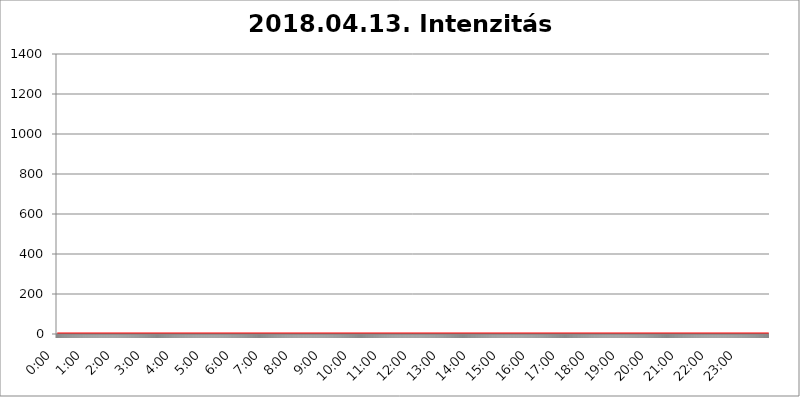
| Category | 2018.04.13. Intenzitás [W/m^2] |
|---|---|
| 0.0 | 0 |
| 0.0006944444444444445 | 0 |
| 0.001388888888888889 | 0 |
| 0.0020833333333333333 | 0 |
| 0.002777777777777778 | 0 |
| 0.003472222222222222 | 0 |
| 0.004166666666666667 | 0 |
| 0.004861111111111111 | 0 |
| 0.005555555555555556 | 0 |
| 0.0062499999999999995 | 0 |
| 0.006944444444444444 | 0 |
| 0.007638888888888889 | 0 |
| 0.008333333333333333 | 0 |
| 0.009027777777777779 | 0 |
| 0.009722222222222222 | 0 |
| 0.010416666666666666 | 0 |
| 0.011111111111111112 | 0 |
| 0.011805555555555555 | 0 |
| 0.012499999999999999 | 0 |
| 0.013194444444444444 | 0 |
| 0.013888888888888888 | 0 |
| 0.014583333333333332 | 0 |
| 0.015277777777777777 | 0 |
| 0.015972222222222224 | 0 |
| 0.016666666666666666 | 0 |
| 0.017361111111111112 | 0 |
| 0.018055555555555557 | 0 |
| 0.01875 | 0 |
| 0.019444444444444445 | 0 |
| 0.02013888888888889 | 0 |
| 0.020833333333333332 | 0 |
| 0.02152777777777778 | 0 |
| 0.022222222222222223 | 0 |
| 0.02291666666666667 | 0 |
| 0.02361111111111111 | 0 |
| 0.024305555555555556 | 0 |
| 0.024999999999999998 | 0 |
| 0.025694444444444447 | 0 |
| 0.02638888888888889 | 0 |
| 0.027083333333333334 | 0 |
| 0.027777777777777776 | 0 |
| 0.02847222222222222 | 0 |
| 0.029166666666666664 | 0 |
| 0.029861111111111113 | 0 |
| 0.030555555555555555 | 0 |
| 0.03125 | 0 |
| 0.03194444444444445 | 0 |
| 0.03263888888888889 | 0 |
| 0.03333333333333333 | 0 |
| 0.034027777777777775 | 0 |
| 0.034722222222222224 | 0 |
| 0.035416666666666666 | 0 |
| 0.036111111111111115 | 0 |
| 0.03680555555555556 | 0 |
| 0.0375 | 0 |
| 0.03819444444444444 | 0 |
| 0.03888888888888889 | 0 |
| 0.03958333333333333 | 0 |
| 0.04027777777777778 | 0 |
| 0.04097222222222222 | 0 |
| 0.041666666666666664 | 0 |
| 0.042361111111111106 | 0 |
| 0.04305555555555556 | 0 |
| 0.043750000000000004 | 0 |
| 0.044444444444444446 | 0 |
| 0.04513888888888889 | 0 |
| 0.04583333333333334 | 0 |
| 0.04652777777777778 | 0 |
| 0.04722222222222222 | 0 |
| 0.04791666666666666 | 0 |
| 0.04861111111111111 | 0 |
| 0.049305555555555554 | 0 |
| 0.049999999999999996 | 0 |
| 0.05069444444444445 | 0 |
| 0.051388888888888894 | 0 |
| 0.052083333333333336 | 0 |
| 0.05277777777777778 | 0 |
| 0.05347222222222222 | 0 |
| 0.05416666666666667 | 0 |
| 0.05486111111111111 | 0 |
| 0.05555555555555555 | 0 |
| 0.05625 | 0 |
| 0.05694444444444444 | 0 |
| 0.057638888888888885 | 0 |
| 0.05833333333333333 | 0 |
| 0.05902777777777778 | 0 |
| 0.059722222222222225 | 0 |
| 0.06041666666666667 | 0 |
| 0.061111111111111116 | 0 |
| 0.06180555555555556 | 0 |
| 0.0625 | 0 |
| 0.06319444444444444 | 0 |
| 0.06388888888888888 | 0 |
| 0.06458333333333334 | 0 |
| 0.06527777777777778 | 0 |
| 0.06597222222222222 | 0 |
| 0.06666666666666667 | 0 |
| 0.06736111111111111 | 0 |
| 0.06805555555555555 | 0 |
| 0.06874999999999999 | 0 |
| 0.06944444444444443 | 0 |
| 0.07013888888888889 | 0 |
| 0.07083333333333333 | 0 |
| 0.07152777777777779 | 0 |
| 0.07222222222222223 | 0 |
| 0.07291666666666667 | 0 |
| 0.07361111111111111 | 0 |
| 0.07430555555555556 | 0 |
| 0.075 | 0 |
| 0.07569444444444444 | 0 |
| 0.0763888888888889 | 0 |
| 0.07708333333333334 | 0 |
| 0.07777777777777778 | 0 |
| 0.07847222222222222 | 0 |
| 0.07916666666666666 | 0 |
| 0.0798611111111111 | 0 |
| 0.08055555555555556 | 0 |
| 0.08125 | 0 |
| 0.08194444444444444 | 0 |
| 0.08263888888888889 | 0 |
| 0.08333333333333333 | 0 |
| 0.08402777777777777 | 0 |
| 0.08472222222222221 | 0 |
| 0.08541666666666665 | 0 |
| 0.08611111111111112 | 0 |
| 0.08680555555555557 | 0 |
| 0.08750000000000001 | 0 |
| 0.08819444444444445 | 0 |
| 0.08888888888888889 | 0 |
| 0.08958333333333333 | 0 |
| 0.09027777777777778 | 0 |
| 0.09097222222222222 | 0 |
| 0.09166666666666667 | 0 |
| 0.09236111111111112 | 0 |
| 0.09305555555555556 | 0 |
| 0.09375 | 0 |
| 0.09444444444444444 | 0 |
| 0.09513888888888888 | 0 |
| 0.09583333333333333 | 0 |
| 0.09652777777777777 | 0 |
| 0.09722222222222222 | 0 |
| 0.09791666666666667 | 0 |
| 0.09861111111111111 | 0 |
| 0.09930555555555555 | 0 |
| 0.09999999999999999 | 0 |
| 0.10069444444444443 | 0 |
| 0.1013888888888889 | 0 |
| 0.10208333333333335 | 0 |
| 0.10277777777777779 | 0 |
| 0.10347222222222223 | 0 |
| 0.10416666666666667 | 0 |
| 0.10486111111111111 | 0 |
| 0.10555555555555556 | 0 |
| 0.10625 | 0 |
| 0.10694444444444444 | 0 |
| 0.1076388888888889 | 0 |
| 0.10833333333333334 | 0 |
| 0.10902777777777778 | 0 |
| 0.10972222222222222 | 0 |
| 0.1111111111111111 | 0 |
| 0.11180555555555556 | 0 |
| 0.11180555555555556 | 0 |
| 0.1125 | 0 |
| 0.11319444444444444 | 0 |
| 0.11388888888888889 | 0 |
| 0.11458333333333333 | 0 |
| 0.11527777777777777 | 0 |
| 0.11597222222222221 | 0 |
| 0.11666666666666665 | 0 |
| 0.1173611111111111 | 0 |
| 0.11805555555555557 | 0 |
| 0.11944444444444445 | 0 |
| 0.12013888888888889 | 0 |
| 0.12083333333333333 | 0 |
| 0.12152777777777778 | 0 |
| 0.12222222222222223 | 0 |
| 0.12291666666666667 | 0 |
| 0.12291666666666667 | 0 |
| 0.12361111111111112 | 0 |
| 0.12430555555555556 | 0 |
| 0.125 | 0 |
| 0.12569444444444444 | 0 |
| 0.12638888888888888 | 0 |
| 0.12708333333333333 | 0 |
| 0.16875 | 0 |
| 0.12847222222222224 | 0 |
| 0.12916666666666668 | 0 |
| 0.12986111111111112 | 0 |
| 0.13055555555555556 | 0 |
| 0.13125 | 0 |
| 0.13194444444444445 | 0 |
| 0.1326388888888889 | 0 |
| 0.13333333333333333 | 0 |
| 0.13402777777777777 | 0 |
| 0.13402777777777777 | 0 |
| 0.13472222222222222 | 0 |
| 0.13541666666666666 | 0 |
| 0.1361111111111111 | 0 |
| 0.13749999999999998 | 0 |
| 0.13819444444444443 | 0 |
| 0.1388888888888889 | 0 |
| 0.13958333333333334 | 0 |
| 0.14027777777777778 | 0 |
| 0.14097222222222222 | 0 |
| 0.14166666666666666 | 0 |
| 0.1423611111111111 | 0 |
| 0.14305555555555557 | 0 |
| 0.14375000000000002 | 0 |
| 0.14444444444444446 | 0 |
| 0.1451388888888889 | 0 |
| 0.1451388888888889 | 0 |
| 0.14652777777777778 | 0 |
| 0.14722222222222223 | 0 |
| 0.14791666666666667 | 0 |
| 0.1486111111111111 | 0 |
| 0.14930555555555555 | 0 |
| 0.15 | 0 |
| 0.15069444444444444 | 0 |
| 0.15138888888888888 | 0 |
| 0.15208333333333332 | 0 |
| 0.15277777777777776 | 0 |
| 0.15347222222222223 | 0 |
| 0.15416666666666667 | 0 |
| 0.15486111111111112 | 0 |
| 0.15555555555555556 | 0 |
| 0.15625 | 0 |
| 0.15694444444444444 | 0 |
| 0.15763888888888888 | 0 |
| 0.15833333333333333 | 0 |
| 0.15902777777777777 | 0 |
| 0.15972222222222224 | 0 |
| 0.16041666666666668 | 0 |
| 0.16111111111111112 | 0 |
| 0.16180555555555556 | 0 |
| 0.1625 | 0 |
| 0.16319444444444445 | 0 |
| 0.1638888888888889 | 0 |
| 0.16458333333333333 | 0 |
| 0.16527777777777777 | 0 |
| 0.16597222222222222 | 0 |
| 0.16666666666666666 | 0 |
| 0.1673611111111111 | 0 |
| 0.16805555555555554 | 0 |
| 0.16874999999999998 | 0 |
| 0.16944444444444443 | 0 |
| 0.17013888888888887 | 0 |
| 0.1708333333333333 | 0 |
| 0.17152777777777775 | 0 |
| 0.17222222222222225 | 0 |
| 0.1729166666666667 | 0 |
| 0.17361111111111113 | 0 |
| 0.17430555555555557 | 0 |
| 0.17500000000000002 | 0 |
| 0.17569444444444446 | 0 |
| 0.1763888888888889 | 0 |
| 0.17708333333333334 | 0 |
| 0.17777777777777778 | 0 |
| 0.17847222222222223 | 0 |
| 0.17916666666666667 | 0 |
| 0.1798611111111111 | 0 |
| 0.18055555555555555 | 0 |
| 0.18125 | 0 |
| 0.18194444444444444 | 0 |
| 0.1826388888888889 | 0 |
| 0.18333333333333335 | 0 |
| 0.1840277777777778 | 0 |
| 0.18472222222222223 | 0 |
| 0.18541666666666667 | 0 |
| 0.18611111111111112 | 0 |
| 0.18680555555555556 | 0 |
| 0.1875 | 0 |
| 0.18819444444444444 | 0 |
| 0.18888888888888888 | 0 |
| 0.18958333333333333 | 0 |
| 0.19027777777777777 | 0 |
| 0.1909722222222222 | 0 |
| 0.19166666666666665 | 0 |
| 0.19236111111111112 | 0 |
| 0.19305555555555554 | 0 |
| 0.19375 | 0 |
| 0.19444444444444445 | 0 |
| 0.1951388888888889 | 0 |
| 0.19583333333333333 | 0 |
| 0.19652777777777777 | 0 |
| 0.19722222222222222 | 0 |
| 0.19791666666666666 | 0 |
| 0.1986111111111111 | 0 |
| 0.19930555555555554 | 0 |
| 0.19999999999999998 | 0 |
| 0.20069444444444443 | 0 |
| 0.20138888888888887 | 0 |
| 0.2020833333333333 | 0 |
| 0.2027777777777778 | 0 |
| 0.2034722222222222 | 0 |
| 0.2041666666666667 | 0 |
| 0.20486111111111113 | 0 |
| 0.20555555555555557 | 0 |
| 0.20625000000000002 | 0 |
| 0.20694444444444446 | 0 |
| 0.2076388888888889 | 0 |
| 0.20833333333333334 | 0 |
| 0.20902777777777778 | 0 |
| 0.20972222222222223 | 0 |
| 0.21041666666666667 | 0 |
| 0.2111111111111111 | 0 |
| 0.21180555555555555 | 0 |
| 0.2125 | 0 |
| 0.21319444444444444 | 0 |
| 0.2138888888888889 | 0 |
| 0.21458333333333335 | 0 |
| 0.2152777777777778 | 0 |
| 0.21597222222222223 | 0 |
| 0.21666666666666667 | 0 |
| 0.21736111111111112 | 0 |
| 0.21805555555555556 | 0 |
| 0.21875 | 0 |
| 0.21944444444444444 | 0 |
| 0.22013888888888888 | 0 |
| 0.22083333333333333 | 0 |
| 0.22152777777777777 | 0 |
| 0.2222222222222222 | 0 |
| 0.22291666666666665 | 0 |
| 0.2236111111111111 | 0 |
| 0.22430555555555556 | 0 |
| 0.225 | 0 |
| 0.22569444444444445 | 0 |
| 0.2263888888888889 | 0 |
| 0.22708333333333333 | 0 |
| 0.22777777777777777 | 0 |
| 0.22847222222222222 | 0 |
| 0.22916666666666666 | 0 |
| 0.2298611111111111 | 0 |
| 0.23055555555555554 | 0 |
| 0.23124999999999998 | 0 |
| 0.23194444444444443 | 0 |
| 0.23263888888888887 | 0 |
| 0.2333333333333333 | 0 |
| 0.2340277777777778 | 0 |
| 0.2347222222222222 | 0 |
| 0.2354166666666667 | 0 |
| 0.23611111111111113 | 0 |
| 0.23680555555555557 | 0 |
| 0.23750000000000002 | 0 |
| 0.23819444444444446 | 0 |
| 0.2388888888888889 | 0 |
| 0.23958333333333334 | 0 |
| 0.24027777777777778 | 0 |
| 0.24097222222222223 | 0 |
| 0.24166666666666667 | 0 |
| 0.2423611111111111 | 0 |
| 0.24305555555555555 | 0 |
| 0.24375 | 0 |
| 0.24444444444444446 | 0 |
| 0.24513888888888888 | 0 |
| 0.24583333333333335 | 0 |
| 0.2465277777777778 | 0 |
| 0.24722222222222223 | 0 |
| 0.24791666666666667 | 0 |
| 0.24861111111111112 | 0 |
| 0.24930555555555556 | 0 |
| 0.25 | 0 |
| 0.25069444444444444 | 0 |
| 0.2513888888888889 | 0 |
| 0.2520833333333333 | 0 |
| 0.25277777777777777 | 0 |
| 0.2534722222222222 | 0 |
| 0.25416666666666665 | 0 |
| 0.2548611111111111 | 0 |
| 0.2555555555555556 | 0 |
| 0.25625000000000003 | 0 |
| 0.2569444444444445 | 0 |
| 0.2576388888888889 | 0 |
| 0.25833333333333336 | 0 |
| 0.2590277777777778 | 0 |
| 0.25972222222222224 | 0 |
| 0.2604166666666667 | 0 |
| 0.2611111111111111 | 0 |
| 0.26180555555555557 | 0 |
| 0.2625 | 0 |
| 0.26319444444444445 | 0 |
| 0.2638888888888889 | 0 |
| 0.26458333333333334 | 0 |
| 0.2652777777777778 | 0 |
| 0.2659722222222222 | 0 |
| 0.26666666666666666 | 0 |
| 0.2673611111111111 | 0 |
| 0.26805555555555555 | 0 |
| 0.26875 | 0 |
| 0.26944444444444443 | 0 |
| 0.2701388888888889 | 0 |
| 0.2708333333333333 | 0 |
| 0.27152777777777776 | 0 |
| 0.2722222222222222 | 0 |
| 0.27291666666666664 | 0 |
| 0.2736111111111111 | 0 |
| 0.2743055555555555 | 0 |
| 0.27499999999999997 | 0 |
| 0.27569444444444446 | 0 |
| 0.27638888888888885 | 0 |
| 0.27708333333333335 | 0 |
| 0.2777777777777778 | 0 |
| 0.27847222222222223 | 0 |
| 0.2791666666666667 | 0 |
| 0.2798611111111111 | 0 |
| 0.28055555555555556 | 0 |
| 0.28125 | 0 |
| 0.28194444444444444 | 0 |
| 0.2826388888888889 | 0 |
| 0.2833333333333333 | 0 |
| 0.28402777777777777 | 0 |
| 0.2847222222222222 | 0 |
| 0.28541666666666665 | 0 |
| 0.28611111111111115 | 0 |
| 0.28680555555555554 | 0 |
| 0.28750000000000003 | 0 |
| 0.2881944444444445 | 0 |
| 0.2888888888888889 | 0 |
| 0.28958333333333336 | 0 |
| 0.2902777777777778 | 0 |
| 0.29097222222222224 | 0 |
| 0.2916666666666667 | 0 |
| 0.2923611111111111 | 0 |
| 0.29305555555555557 | 0 |
| 0.29375 | 0 |
| 0.29444444444444445 | 0 |
| 0.2951388888888889 | 0 |
| 0.29583333333333334 | 0 |
| 0.2965277777777778 | 0 |
| 0.2972222222222222 | 0 |
| 0.29791666666666666 | 0 |
| 0.2986111111111111 | 0 |
| 0.29930555555555555 | 0 |
| 0.3 | 0 |
| 0.30069444444444443 | 0 |
| 0.3013888888888889 | 0 |
| 0.3020833333333333 | 0 |
| 0.30277777777777776 | 0 |
| 0.3034722222222222 | 0 |
| 0.30416666666666664 | 0 |
| 0.3048611111111111 | 0 |
| 0.3055555555555555 | 0 |
| 0.30624999999999997 | 0 |
| 0.3069444444444444 | 0 |
| 0.3076388888888889 | 0 |
| 0.30833333333333335 | 0 |
| 0.3090277777777778 | 0 |
| 0.30972222222222223 | 0 |
| 0.3104166666666667 | 0 |
| 0.3111111111111111 | 0 |
| 0.31180555555555556 | 0 |
| 0.3125 | 0 |
| 0.31319444444444444 | 0 |
| 0.3138888888888889 | 0 |
| 0.3145833333333333 | 0 |
| 0.31527777777777777 | 0 |
| 0.3159722222222222 | 0 |
| 0.31666666666666665 | 0 |
| 0.31736111111111115 | 0 |
| 0.31805555555555554 | 0 |
| 0.31875000000000003 | 0 |
| 0.3194444444444445 | 0 |
| 0.3201388888888889 | 0 |
| 0.32083333333333336 | 0 |
| 0.3215277777777778 | 0 |
| 0.32222222222222224 | 0 |
| 0.3229166666666667 | 0 |
| 0.3236111111111111 | 0 |
| 0.32430555555555557 | 0 |
| 0.325 | 0 |
| 0.32569444444444445 | 0 |
| 0.3263888888888889 | 0 |
| 0.32708333333333334 | 0 |
| 0.3277777777777778 | 0 |
| 0.3284722222222222 | 0 |
| 0.32916666666666666 | 0 |
| 0.3298611111111111 | 0 |
| 0.33055555555555555 | 0 |
| 0.33125 | 0 |
| 0.33194444444444443 | 0 |
| 0.3326388888888889 | 0 |
| 0.3333333333333333 | 0 |
| 0.3340277777777778 | 0 |
| 0.3347222222222222 | 0 |
| 0.3354166666666667 | 0 |
| 0.3361111111111111 | 0 |
| 0.3368055555555556 | 0 |
| 0.33749999999999997 | 0 |
| 0.33819444444444446 | 0 |
| 0.33888888888888885 | 0 |
| 0.33958333333333335 | 0 |
| 0.34027777777777773 | 0 |
| 0.34097222222222223 | 0 |
| 0.3416666666666666 | 0 |
| 0.3423611111111111 | 0 |
| 0.3430555555555555 | 0 |
| 0.34375 | 0 |
| 0.3444444444444445 | 0 |
| 0.3451388888888889 | 0 |
| 0.3458333333333334 | 0 |
| 0.34652777777777777 | 0 |
| 0.34722222222222227 | 0 |
| 0.34791666666666665 | 0 |
| 0.34861111111111115 | 0 |
| 0.34930555555555554 | 0 |
| 0.35000000000000003 | 0 |
| 0.3506944444444444 | 0 |
| 0.3513888888888889 | 0 |
| 0.3520833333333333 | 0 |
| 0.3527777777777778 | 0 |
| 0.3534722222222222 | 0 |
| 0.3541666666666667 | 0 |
| 0.3548611111111111 | 0 |
| 0.35555555555555557 | 0 |
| 0.35625 | 0 |
| 0.35694444444444445 | 0 |
| 0.3576388888888889 | 0 |
| 0.35833333333333334 | 0 |
| 0.3590277777777778 | 0 |
| 0.3597222222222222 | 0 |
| 0.36041666666666666 | 0 |
| 0.3611111111111111 | 0 |
| 0.36180555555555555 | 0 |
| 0.3625 | 0 |
| 0.36319444444444443 | 0 |
| 0.3638888888888889 | 0 |
| 0.3645833333333333 | 0 |
| 0.3652777777777778 | 0 |
| 0.3659722222222222 | 0 |
| 0.3666666666666667 | 0 |
| 0.3673611111111111 | 0 |
| 0.3680555555555556 | 0 |
| 0.36874999999999997 | 0 |
| 0.36944444444444446 | 0 |
| 0.37013888888888885 | 0 |
| 0.37083333333333335 | 0 |
| 0.37152777777777773 | 0 |
| 0.37222222222222223 | 0 |
| 0.3729166666666666 | 0 |
| 0.3736111111111111 | 0 |
| 0.3743055555555555 | 0 |
| 0.375 | 0 |
| 0.3756944444444445 | 0 |
| 0.3763888888888889 | 0 |
| 0.3770833333333334 | 0 |
| 0.37777777777777777 | 0 |
| 0.37847222222222227 | 0 |
| 0.37916666666666665 | 0 |
| 0.37986111111111115 | 0 |
| 0.38055555555555554 | 0 |
| 0.38125000000000003 | 0 |
| 0.3819444444444444 | 0 |
| 0.3826388888888889 | 0 |
| 0.3833333333333333 | 0 |
| 0.3840277777777778 | 0 |
| 0.3847222222222222 | 0 |
| 0.3854166666666667 | 0 |
| 0.3861111111111111 | 0 |
| 0.38680555555555557 | 0 |
| 0.3875 | 0 |
| 0.38819444444444445 | 0 |
| 0.3888888888888889 | 0 |
| 0.38958333333333334 | 0 |
| 0.3902777777777778 | 0 |
| 0.3909722222222222 | 0 |
| 0.39166666666666666 | 0 |
| 0.3923611111111111 | 0 |
| 0.39305555555555555 | 0 |
| 0.39375 | 0 |
| 0.39444444444444443 | 0 |
| 0.3951388888888889 | 0 |
| 0.3958333333333333 | 0 |
| 0.3965277777777778 | 0 |
| 0.3972222222222222 | 0 |
| 0.3979166666666667 | 0 |
| 0.3986111111111111 | 0 |
| 0.3993055555555556 | 0 |
| 0.39999999999999997 | 0 |
| 0.40069444444444446 | 0 |
| 0.40138888888888885 | 0 |
| 0.40208333333333335 | 0 |
| 0.40277777777777773 | 0 |
| 0.40347222222222223 | 0 |
| 0.4041666666666666 | 0 |
| 0.4048611111111111 | 0 |
| 0.4055555555555555 | 0 |
| 0.40625 | 0 |
| 0.4069444444444445 | 0 |
| 0.4076388888888889 | 0 |
| 0.4083333333333334 | 0 |
| 0.40902777777777777 | 0 |
| 0.40972222222222227 | 0 |
| 0.41041666666666665 | 0 |
| 0.41111111111111115 | 0 |
| 0.41180555555555554 | 0 |
| 0.41250000000000003 | 0 |
| 0.4131944444444444 | 0 |
| 0.4138888888888889 | 0 |
| 0.4145833333333333 | 0 |
| 0.4152777777777778 | 0 |
| 0.4159722222222222 | 0 |
| 0.4166666666666667 | 0 |
| 0.4173611111111111 | 0 |
| 0.41805555555555557 | 0 |
| 0.41875 | 0 |
| 0.41944444444444445 | 0 |
| 0.4201388888888889 | 0 |
| 0.42083333333333334 | 0 |
| 0.4215277777777778 | 0 |
| 0.4222222222222222 | 0 |
| 0.42291666666666666 | 0 |
| 0.4236111111111111 | 0 |
| 0.42430555555555555 | 0 |
| 0.425 | 0 |
| 0.42569444444444443 | 0 |
| 0.4263888888888889 | 0 |
| 0.4270833333333333 | 0 |
| 0.4277777777777778 | 0 |
| 0.4284722222222222 | 0 |
| 0.4291666666666667 | 0 |
| 0.4298611111111111 | 0 |
| 0.4305555555555556 | 0 |
| 0.43124999999999997 | 0 |
| 0.43194444444444446 | 0 |
| 0.43263888888888885 | 0 |
| 0.43333333333333335 | 0 |
| 0.43402777777777773 | 0 |
| 0.43472222222222223 | 0 |
| 0.4354166666666666 | 0 |
| 0.4361111111111111 | 0 |
| 0.4368055555555555 | 0 |
| 0.4375 | 0 |
| 0.4381944444444445 | 0 |
| 0.4388888888888889 | 0 |
| 0.4395833333333334 | 0 |
| 0.44027777777777777 | 0 |
| 0.44097222222222227 | 0 |
| 0.44166666666666665 | 0 |
| 0.44236111111111115 | 0 |
| 0.44305555555555554 | 0 |
| 0.44375000000000003 | 0 |
| 0.4444444444444444 | 0 |
| 0.4451388888888889 | 0 |
| 0.4458333333333333 | 0 |
| 0.4465277777777778 | 0 |
| 0.4472222222222222 | 0 |
| 0.4479166666666667 | 0 |
| 0.4486111111111111 | 0 |
| 0.44930555555555557 | 0 |
| 0.45 | 0 |
| 0.45069444444444445 | 0 |
| 0.4513888888888889 | 0 |
| 0.45208333333333334 | 0 |
| 0.4527777777777778 | 0 |
| 0.4534722222222222 | 0 |
| 0.45416666666666666 | 0 |
| 0.4548611111111111 | 0 |
| 0.45555555555555555 | 0 |
| 0.45625 | 0 |
| 0.45694444444444443 | 0 |
| 0.4576388888888889 | 0 |
| 0.4583333333333333 | 0 |
| 0.4590277777777778 | 0 |
| 0.4597222222222222 | 0 |
| 0.4604166666666667 | 0 |
| 0.4611111111111111 | 0 |
| 0.4618055555555556 | 0 |
| 0.46249999999999997 | 0 |
| 0.46319444444444446 | 0 |
| 0.46388888888888885 | 0 |
| 0.46458333333333335 | 0 |
| 0.46527777777777773 | 0 |
| 0.46597222222222223 | 0 |
| 0.4666666666666666 | 0 |
| 0.4673611111111111 | 0 |
| 0.4680555555555555 | 0 |
| 0.46875 | 0 |
| 0.4694444444444445 | 0 |
| 0.4701388888888889 | 0 |
| 0.4708333333333334 | 0 |
| 0.47152777777777777 | 0 |
| 0.47222222222222227 | 0 |
| 0.47291666666666665 | 0 |
| 0.47361111111111115 | 0 |
| 0.47430555555555554 | 0 |
| 0.47500000000000003 | 0 |
| 0.4756944444444444 | 0 |
| 0.4763888888888889 | 0 |
| 0.4770833333333333 | 0 |
| 0.4777777777777778 | 0 |
| 0.4784722222222222 | 0 |
| 0.4791666666666667 | 0 |
| 0.4798611111111111 | 0 |
| 0.48055555555555557 | 0 |
| 0.48125 | 0 |
| 0.48194444444444445 | 0 |
| 0.4826388888888889 | 0 |
| 0.48333333333333334 | 0 |
| 0.4840277777777778 | 0 |
| 0.4847222222222222 | 0 |
| 0.48541666666666666 | 0 |
| 0.4861111111111111 | 0 |
| 0.48680555555555555 | 0 |
| 0.4875 | 0 |
| 0.48819444444444443 | 0 |
| 0.4888888888888889 | 0 |
| 0.4895833333333333 | 0 |
| 0.4902777777777778 | 0 |
| 0.4909722222222222 | 0 |
| 0.4916666666666667 | 0 |
| 0.4923611111111111 | 0 |
| 0.4930555555555556 | 0 |
| 0.49374999999999997 | 0 |
| 0.49444444444444446 | 0 |
| 0.49513888888888885 | 0 |
| 0.49583333333333335 | 0 |
| 0.49652777777777773 | 0 |
| 0.49722222222222223 | 0 |
| 0.4979166666666666 | 0 |
| 0.4986111111111111 | 0 |
| 0.4993055555555555 | 0 |
| 0.5 | 0 |
| 0.5006944444444444 | 0 |
| 0.5013888888888889 | 0 |
| 0.5020833333333333 | 0 |
| 0.5027777777777778 | 0 |
| 0.5034722222222222 | 0 |
| 0.5041666666666667 | 0 |
| 0.5048611111111111 | 0 |
| 0.5055555555555555 | 0 |
| 0.50625 | 0 |
| 0.5069444444444444 | 0 |
| 0.5076388888888889 | 0 |
| 0.5083333333333333 | 0 |
| 0.5090277777777777 | 0 |
| 0.5097222222222222 | 0 |
| 0.5104166666666666 | 0 |
| 0.5111111111111112 | 0 |
| 0.5118055555555555 | 0 |
| 0.5125000000000001 | 0 |
| 0.5131944444444444 | 0 |
| 0.513888888888889 | 0 |
| 0.5145833333333333 | 0 |
| 0.5152777777777778 | 0 |
| 0.5159722222222222 | 0 |
| 0.5166666666666667 | 0 |
| 0.517361111111111 | 0 |
| 0.5180555555555556 | 0 |
| 0.5187499999999999 | 0 |
| 0.5194444444444445 | 0 |
| 0.5201388888888888 | 0 |
| 0.5208333333333334 | 0 |
| 0.5215277777777778 | 0 |
| 0.5222222222222223 | 0 |
| 0.5229166666666667 | 0 |
| 0.5236111111111111 | 0 |
| 0.5243055555555556 | 0 |
| 0.525 | 0 |
| 0.5256944444444445 | 0 |
| 0.5263888888888889 | 0 |
| 0.5270833333333333 | 0 |
| 0.5277777777777778 | 0 |
| 0.5284722222222222 | 0 |
| 0.5291666666666667 | 0 |
| 0.5298611111111111 | 0 |
| 0.5305555555555556 | 0 |
| 0.53125 | 0 |
| 0.5319444444444444 | 0 |
| 0.5326388888888889 | 0 |
| 0.5333333333333333 | 0 |
| 0.5340277777777778 | 0 |
| 0.5347222222222222 | 0 |
| 0.5354166666666667 | 0 |
| 0.5361111111111111 | 0 |
| 0.5368055555555555 | 0 |
| 0.5375 | 0 |
| 0.5381944444444444 | 0 |
| 0.5388888888888889 | 0 |
| 0.5395833333333333 | 0 |
| 0.5402777777777777 | 0 |
| 0.5409722222222222 | 0 |
| 0.5416666666666666 | 0 |
| 0.5423611111111112 | 0 |
| 0.5430555555555555 | 0 |
| 0.5437500000000001 | 0 |
| 0.5444444444444444 | 0 |
| 0.545138888888889 | 0 |
| 0.5458333333333333 | 0 |
| 0.5465277777777778 | 0 |
| 0.5472222222222222 | 0 |
| 0.5479166666666667 | 0 |
| 0.548611111111111 | 0 |
| 0.5493055555555556 | 0 |
| 0.5499999999999999 | 0 |
| 0.5506944444444445 | 0 |
| 0.5513888888888888 | 0 |
| 0.5520833333333334 | 0 |
| 0.5527777777777778 | 0 |
| 0.5534722222222223 | 0 |
| 0.5541666666666667 | 0 |
| 0.5548611111111111 | 0 |
| 0.5555555555555556 | 0 |
| 0.55625 | 0 |
| 0.5569444444444445 | 0 |
| 0.5576388888888889 | 0 |
| 0.5583333333333333 | 0 |
| 0.5590277777777778 | 0 |
| 0.5597222222222222 | 0 |
| 0.5604166666666667 | 0 |
| 0.5611111111111111 | 0 |
| 0.5618055555555556 | 0 |
| 0.5625 | 0 |
| 0.5631944444444444 | 0 |
| 0.5638888888888889 | 0 |
| 0.5645833333333333 | 0 |
| 0.5652777777777778 | 0 |
| 0.5659722222222222 | 0 |
| 0.5666666666666667 | 0 |
| 0.5673611111111111 | 0 |
| 0.5680555555555555 | 0 |
| 0.56875 | 0 |
| 0.5694444444444444 | 0 |
| 0.5701388888888889 | 0 |
| 0.5708333333333333 | 0 |
| 0.5715277777777777 | 0 |
| 0.5722222222222222 | 0 |
| 0.5729166666666666 | 0 |
| 0.5736111111111112 | 0 |
| 0.5743055555555555 | 0 |
| 0.5750000000000001 | 0 |
| 0.5756944444444444 | 0 |
| 0.576388888888889 | 0 |
| 0.5770833333333333 | 0 |
| 0.5777777777777778 | 0 |
| 0.5784722222222222 | 0 |
| 0.5791666666666667 | 0 |
| 0.579861111111111 | 0 |
| 0.5805555555555556 | 0 |
| 0.5812499999999999 | 0 |
| 0.5819444444444445 | 0 |
| 0.5826388888888888 | 0 |
| 0.5833333333333334 | 0 |
| 0.5840277777777778 | 0 |
| 0.5847222222222223 | 0 |
| 0.5854166666666667 | 0 |
| 0.5861111111111111 | 0 |
| 0.5868055555555556 | 0 |
| 0.5875 | 0 |
| 0.5881944444444445 | 0 |
| 0.5888888888888889 | 0 |
| 0.5895833333333333 | 0 |
| 0.5902777777777778 | 0 |
| 0.5909722222222222 | 0 |
| 0.5916666666666667 | 0 |
| 0.5923611111111111 | 0 |
| 0.5930555555555556 | 0 |
| 0.59375 | 0 |
| 0.5944444444444444 | 0 |
| 0.5951388888888889 | 0 |
| 0.5958333333333333 | 0 |
| 0.5965277777777778 | 0 |
| 0.5972222222222222 | 0 |
| 0.5979166666666667 | 0 |
| 0.5986111111111111 | 0 |
| 0.5993055555555555 | 0 |
| 0.6 | 0 |
| 0.6006944444444444 | 0 |
| 0.6013888888888889 | 0 |
| 0.6020833333333333 | 0 |
| 0.6027777777777777 | 0 |
| 0.6034722222222222 | 0 |
| 0.6041666666666666 | 0 |
| 0.6048611111111112 | 0 |
| 0.6055555555555555 | 0 |
| 0.6062500000000001 | 0 |
| 0.6069444444444444 | 0 |
| 0.607638888888889 | 0 |
| 0.6083333333333333 | 0 |
| 0.6090277777777778 | 0 |
| 0.6097222222222222 | 0 |
| 0.6104166666666667 | 0 |
| 0.611111111111111 | 0 |
| 0.6118055555555556 | 0 |
| 0.6124999999999999 | 0 |
| 0.6131944444444445 | 0 |
| 0.6138888888888888 | 0 |
| 0.6145833333333334 | 0 |
| 0.6152777777777778 | 0 |
| 0.6159722222222223 | 0 |
| 0.6166666666666667 | 0 |
| 0.6173611111111111 | 0 |
| 0.6180555555555556 | 0 |
| 0.61875 | 0 |
| 0.6194444444444445 | 0 |
| 0.6201388888888889 | 0 |
| 0.6208333333333333 | 0 |
| 0.6215277777777778 | 0 |
| 0.6222222222222222 | 0 |
| 0.6229166666666667 | 0 |
| 0.6236111111111111 | 0 |
| 0.6243055555555556 | 0 |
| 0.625 | 0 |
| 0.6256944444444444 | 0 |
| 0.6263888888888889 | 0 |
| 0.6270833333333333 | 0 |
| 0.6277777777777778 | 0 |
| 0.6284722222222222 | 0 |
| 0.6291666666666667 | 0 |
| 0.6298611111111111 | 0 |
| 0.6305555555555555 | 0 |
| 0.63125 | 0 |
| 0.6319444444444444 | 0 |
| 0.6326388888888889 | 0 |
| 0.6333333333333333 | 0 |
| 0.6340277777777777 | 0 |
| 0.6347222222222222 | 0 |
| 0.6354166666666666 | 0 |
| 0.6361111111111112 | 0 |
| 0.6368055555555555 | 0 |
| 0.6375000000000001 | 0 |
| 0.6381944444444444 | 0 |
| 0.638888888888889 | 0 |
| 0.6395833333333333 | 0 |
| 0.6402777777777778 | 0 |
| 0.6409722222222222 | 0 |
| 0.6416666666666667 | 0 |
| 0.642361111111111 | 0 |
| 0.6430555555555556 | 0 |
| 0.6437499999999999 | 0 |
| 0.6444444444444445 | 0 |
| 0.6451388888888888 | 0 |
| 0.6458333333333334 | 0 |
| 0.6465277777777778 | 0 |
| 0.6472222222222223 | 0 |
| 0.6479166666666667 | 0 |
| 0.6486111111111111 | 0 |
| 0.6493055555555556 | 0 |
| 0.65 | 0 |
| 0.6506944444444445 | 0 |
| 0.6513888888888889 | 0 |
| 0.6520833333333333 | 0 |
| 0.6527777777777778 | 0 |
| 0.6534722222222222 | 0 |
| 0.6541666666666667 | 0 |
| 0.6548611111111111 | 0 |
| 0.6555555555555556 | 0 |
| 0.65625 | 0 |
| 0.6569444444444444 | 0 |
| 0.6576388888888889 | 0 |
| 0.6583333333333333 | 0 |
| 0.6590277777777778 | 0 |
| 0.6597222222222222 | 0 |
| 0.6604166666666667 | 0 |
| 0.6611111111111111 | 0 |
| 0.6618055555555555 | 0 |
| 0.6625 | 0 |
| 0.6631944444444444 | 0 |
| 0.6638888888888889 | 0 |
| 0.6645833333333333 | 0 |
| 0.6652777777777777 | 0 |
| 0.6659722222222222 | 0 |
| 0.6666666666666666 | 0 |
| 0.6673611111111111 | 0 |
| 0.6680555555555556 | 0 |
| 0.6687500000000001 | 0 |
| 0.6694444444444444 | 0 |
| 0.6701388888888888 | 0 |
| 0.6708333333333334 | 0 |
| 0.6715277777777778 | 0 |
| 0.6722222222222222 | 0 |
| 0.6729166666666666 | 0 |
| 0.6736111111111112 | 0 |
| 0.6743055555555556 | 0 |
| 0.6749999999999999 | 0 |
| 0.6756944444444444 | 0 |
| 0.6763888888888889 | 0 |
| 0.6770833333333334 | 0 |
| 0.6777777777777777 | 0 |
| 0.6784722222222223 | 0 |
| 0.6791666666666667 | 0 |
| 0.6798611111111111 | 0 |
| 0.6805555555555555 | 0 |
| 0.68125 | 0 |
| 0.6819444444444445 | 0 |
| 0.6826388888888889 | 0 |
| 0.6833333333333332 | 0 |
| 0.6840277777777778 | 0 |
| 0.6847222222222222 | 0 |
| 0.6854166666666667 | 0 |
| 0.686111111111111 | 0 |
| 0.6868055555555556 | 0 |
| 0.6875 | 0 |
| 0.6881944444444444 | 0 |
| 0.688888888888889 | 0 |
| 0.6895833333333333 | 0 |
| 0.6902777777777778 | 0 |
| 0.6909722222222222 | 0 |
| 0.6916666666666668 | 0 |
| 0.6923611111111111 | 0 |
| 0.6930555555555555 | 0 |
| 0.69375 | 0 |
| 0.6944444444444445 | 0 |
| 0.6951388888888889 | 0 |
| 0.6958333333333333 | 0 |
| 0.6965277777777777 | 0 |
| 0.6972222222222223 | 0 |
| 0.6979166666666666 | 0 |
| 0.6986111111111111 | 0 |
| 0.6993055555555556 | 0 |
| 0.7000000000000001 | 0 |
| 0.7006944444444444 | 0 |
| 0.7013888888888888 | 0 |
| 0.7020833333333334 | 0 |
| 0.7027777777777778 | 0 |
| 0.7034722222222222 | 0 |
| 0.7041666666666666 | 0 |
| 0.7048611111111112 | 0 |
| 0.7055555555555556 | 0 |
| 0.7062499999999999 | 0 |
| 0.7069444444444444 | 0 |
| 0.7076388888888889 | 0 |
| 0.7083333333333334 | 0 |
| 0.7090277777777777 | 0 |
| 0.7097222222222223 | 0 |
| 0.7104166666666667 | 0 |
| 0.7111111111111111 | 0 |
| 0.7118055555555555 | 0 |
| 0.7125 | 0 |
| 0.7131944444444445 | 0 |
| 0.7138888888888889 | 0 |
| 0.7145833333333332 | 0 |
| 0.7152777777777778 | 0 |
| 0.7159722222222222 | 0 |
| 0.7166666666666667 | 0 |
| 0.717361111111111 | 0 |
| 0.7180555555555556 | 0 |
| 0.71875 | 0 |
| 0.7194444444444444 | 0 |
| 0.720138888888889 | 0 |
| 0.7208333333333333 | 0 |
| 0.7215277777777778 | 0 |
| 0.7222222222222222 | 0 |
| 0.7229166666666668 | 0 |
| 0.7236111111111111 | 0 |
| 0.7243055555555555 | 0 |
| 0.725 | 0 |
| 0.7256944444444445 | 0 |
| 0.7263888888888889 | 0 |
| 0.7270833333333333 | 0 |
| 0.7277777777777777 | 0 |
| 0.7284722222222223 | 0 |
| 0.7291666666666666 | 0 |
| 0.7298611111111111 | 0 |
| 0.7305555555555556 | 0 |
| 0.7312500000000001 | 0 |
| 0.7319444444444444 | 0 |
| 0.7326388888888888 | 0 |
| 0.7333333333333334 | 0 |
| 0.7340277777777778 | 0 |
| 0.7347222222222222 | 0 |
| 0.7354166666666666 | 0 |
| 0.7361111111111112 | 0 |
| 0.7368055555555556 | 0 |
| 0.7374999999999999 | 0 |
| 0.7381944444444444 | 0 |
| 0.7388888888888889 | 0 |
| 0.7395833333333334 | 0 |
| 0.7402777777777777 | 0 |
| 0.7409722222222223 | 0 |
| 0.7416666666666667 | 0 |
| 0.7423611111111111 | 0 |
| 0.7430555555555555 | 0 |
| 0.74375 | 0 |
| 0.7444444444444445 | 0 |
| 0.7451388888888889 | 0 |
| 0.7458333333333332 | 0 |
| 0.7465277777777778 | 0 |
| 0.7472222222222222 | 0 |
| 0.7479166666666667 | 0 |
| 0.748611111111111 | 0 |
| 0.7493055555555556 | 0 |
| 0.75 | 0 |
| 0.7506944444444444 | 0 |
| 0.751388888888889 | 0 |
| 0.7520833333333333 | 0 |
| 0.7527777777777778 | 0 |
| 0.7534722222222222 | 0 |
| 0.7541666666666668 | 0 |
| 0.7548611111111111 | 0 |
| 0.7555555555555555 | 0 |
| 0.75625 | 0 |
| 0.7569444444444445 | 0 |
| 0.7576388888888889 | 0 |
| 0.7583333333333333 | 0 |
| 0.7590277777777777 | 0 |
| 0.7597222222222223 | 0 |
| 0.7604166666666666 | 0 |
| 0.7611111111111111 | 0 |
| 0.7618055555555556 | 0 |
| 0.7625000000000001 | 0 |
| 0.7631944444444444 | 0 |
| 0.7638888888888888 | 0 |
| 0.7645833333333334 | 0 |
| 0.7652777777777778 | 0 |
| 0.7659722222222222 | 0 |
| 0.7666666666666666 | 0 |
| 0.7673611111111112 | 0 |
| 0.7680555555555556 | 0 |
| 0.7687499999999999 | 0 |
| 0.7694444444444444 | 0 |
| 0.7701388888888889 | 0 |
| 0.7708333333333334 | 0 |
| 0.7715277777777777 | 0 |
| 0.7722222222222223 | 0 |
| 0.7729166666666667 | 0 |
| 0.7736111111111111 | 0 |
| 0.7743055555555555 | 0 |
| 0.775 | 0 |
| 0.7756944444444445 | 0 |
| 0.7763888888888889 | 0 |
| 0.7770833333333332 | 0 |
| 0.7777777777777778 | 0 |
| 0.7784722222222222 | 0 |
| 0.7791666666666667 | 0 |
| 0.779861111111111 | 0 |
| 0.7805555555555556 | 0 |
| 0.78125 | 0 |
| 0.7819444444444444 | 0 |
| 0.782638888888889 | 0 |
| 0.7833333333333333 | 0 |
| 0.7840277777777778 | 0 |
| 0.7847222222222222 | 0 |
| 0.7854166666666668 | 0 |
| 0.7861111111111111 | 0 |
| 0.7868055555555555 | 0 |
| 0.7875 | 0 |
| 0.7881944444444445 | 0 |
| 0.7888888888888889 | 0 |
| 0.7895833333333333 | 0 |
| 0.7902777777777777 | 0 |
| 0.7909722222222223 | 0 |
| 0.7916666666666666 | 0 |
| 0.7923611111111111 | 0 |
| 0.7930555555555556 | 0 |
| 0.7937500000000001 | 0 |
| 0.7944444444444444 | 0 |
| 0.7951388888888888 | 0 |
| 0.7958333333333334 | 0 |
| 0.7965277777777778 | 0 |
| 0.7972222222222222 | 0 |
| 0.7979166666666666 | 0 |
| 0.7986111111111112 | 0 |
| 0.7993055555555556 | 0 |
| 0.7999999999999999 | 0 |
| 0.8006944444444444 | 0 |
| 0.8013888888888889 | 0 |
| 0.8020833333333334 | 0 |
| 0.8027777777777777 | 0 |
| 0.8034722222222223 | 0 |
| 0.8041666666666667 | 0 |
| 0.8048611111111111 | 0 |
| 0.8055555555555555 | 0 |
| 0.80625 | 0 |
| 0.8069444444444445 | 0 |
| 0.8076388888888889 | 0 |
| 0.8083333333333332 | 0 |
| 0.8090277777777778 | 0 |
| 0.8097222222222222 | 0 |
| 0.8104166666666667 | 0 |
| 0.811111111111111 | 0 |
| 0.8118055555555556 | 0 |
| 0.8125 | 0 |
| 0.8131944444444444 | 0 |
| 0.813888888888889 | 0 |
| 0.8145833333333333 | 0 |
| 0.8152777777777778 | 0 |
| 0.8159722222222222 | 0 |
| 0.8166666666666668 | 0 |
| 0.8173611111111111 | 0 |
| 0.8180555555555555 | 0 |
| 0.81875 | 0 |
| 0.8194444444444445 | 0 |
| 0.8201388888888889 | 0 |
| 0.8208333333333333 | 0 |
| 0.8215277777777777 | 0 |
| 0.8222222222222223 | 0 |
| 0.8229166666666666 | 0 |
| 0.8236111111111111 | 0 |
| 0.8243055555555556 | 0 |
| 0.8250000000000001 | 0 |
| 0.8256944444444444 | 0 |
| 0.8263888888888888 | 0 |
| 0.8270833333333334 | 0 |
| 0.8277777777777778 | 0 |
| 0.8284722222222222 | 0 |
| 0.8291666666666666 | 0 |
| 0.8298611111111112 | 0 |
| 0.8305555555555556 | 0 |
| 0.8312499999999999 | 0 |
| 0.8319444444444444 | 0 |
| 0.8326388888888889 | 0 |
| 0.8333333333333334 | 0 |
| 0.8340277777777777 | 0 |
| 0.8347222222222223 | 0 |
| 0.8354166666666667 | 0 |
| 0.8361111111111111 | 0 |
| 0.8368055555555555 | 0 |
| 0.8375 | 0 |
| 0.8381944444444445 | 0 |
| 0.8388888888888889 | 0 |
| 0.8395833333333332 | 0 |
| 0.8402777777777778 | 0 |
| 0.8409722222222222 | 0 |
| 0.8416666666666667 | 0 |
| 0.842361111111111 | 0 |
| 0.8430555555555556 | 0 |
| 0.84375 | 0 |
| 0.8444444444444444 | 0 |
| 0.845138888888889 | 0 |
| 0.8458333333333333 | 0 |
| 0.8465277777777778 | 0 |
| 0.8472222222222222 | 0 |
| 0.8479166666666668 | 0 |
| 0.8486111111111111 | 0 |
| 0.8493055555555555 | 0 |
| 0.85 | 0 |
| 0.8506944444444445 | 0 |
| 0.8513888888888889 | 0 |
| 0.8520833333333333 | 0 |
| 0.8527777777777777 | 0 |
| 0.8534722222222223 | 0 |
| 0.8541666666666666 | 0 |
| 0.8548611111111111 | 0 |
| 0.8555555555555556 | 0 |
| 0.8562500000000001 | 0 |
| 0.8569444444444444 | 0 |
| 0.8576388888888888 | 0 |
| 0.8583333333333334 | 0 |
| 0.8590277777777778 | 0 |
| 0.8597222222222222 | 0 |
| 0.8604166666666666 | 0 |
| 0.8611111111111112 | 0 |
| 0.8618055555555556 | 0 |
| 0.8624999999999999 | 0 |
| 0.8631944444444444 | 0 |
| 0.8638888888888889 | 0 |
| 0.8645833333333334 | 0 |
| 0.8652777777777777 | 0 |
| 0.8659722222222223 | 0 |
| 0.8666666666666667 | 0 |
| 0.8673611111111111 | 0 |
| 0.8680555555555555 | 0 |
| 0.86875 | 0 |
| 0.8694444444444445 | 0 |
| 0.8701388888888889 | 0 |
| 0.8708333333333332 | 0 |
| 0.8715277777777778 | 0 |
| 0.8722222222222222 | 0 |
| 0.8729166666666667 | 0 |
| 0.873611111111111 | 0 |
| 0.8743055555555556 | 0 |
| 0.875 | 0 |
| 0.8756944444444444 | 0 |
| 0.876388888888889 | 0 |
| 0.8770833333333333 | 0 |
| 0.8777777777777778 | 0 |
| 0.8784722222222222 | 0 |
| 0.8791666666666668 | 0 |
| 0.8798611111111111 | 0 |
| 0.8805555555555555 | 0 |
| 0.88125 | 0 |
| 0.8819444444444445 | 0 |
| 0.8826388888888889 | 0 |
| 0.8833333333333333 | 0 |
| 0.8840277777777777 | 0 |
| 0.8847222222222223 | 0 |
| 0.8854166666666666 | 0 |
| 0.8861111111111111 | 0 |
| 0.8868055555555556 | 0 |
| 0.8875000000000001 | 0 |
| 0.8881944444444444 | 0 |
| 0.8888888888888888 | 0 |
| 0.8895833333333334 | 0 |
| 0.8902777777777778 | 0 |
| 0.8909722222222222 | 0 |
| 0.8916666666666666 | 0 |
| 0.8923611111111112 | 0 |
| 0.8930555555555556 | 0 |
| 0.8937499999999999 | 0 |
| 0.8944444444444444 | 0 |
| 0.8951388888888889 | 0 |
| 0.8958333333333334 | 0 |
| 0.8965277777777777 | 0 |
| 0.8972222222222223 | 0 |
| 0.8979166666666667 | 0 |
| 0.8986111111111111 | 0 |
| 0.8993055555555555 | 0 |
| 0.9 | 0 |
| 0.9006944444444445 | 0 |
| 0.9013888888888889 | 0 |
| 0.9020833333333332 | 0 |
| 0.9027777777777778 | 0 |
| 0.9034722222222222 | 0 |
| 0.9041666666666667 | 0 |
| 0.904861111111111 | 0 |
| 0.9055555555555556 | 0 |
| 0.90625 | 0 |
| 0.9069444444444444 | 0 |
| 0.907638888888889 | 0 |
| 0.9083333333333333 | 0 |
| 0.9090277777777778 | 0 |
| 0.9097222222222222 | 0 |
| 0.9104166666666668 | 0 |
| 0.9111111111111111 | 0 |
| 0.9118055555555555 | 0 |
| 0.9125 | 0 |
| 0.9131944444444445 | 0 |
| 0.9138888888888889 | 0 |
| 0.9145833333333333 | 0 |
| 0.9152777777777777 | 0 |
| 0.9159722222222223 | 0 |
| 0.9166666666666666 | 0 |
| 0.9173611111111111 | 0 |
| 0.9180555555555556 | 0 |
| 0.9187500000000001 | 0 |
| 0.9194444444444444 | 0 |
| 0.9201388888888888 | 0 |
| 0.9208333333333334 | 0 |
| 0.9215277777777778 | 0 |
| 0.9222222222222222 | 0 |
| 0.9229166666666666 | 0 |
| 0.9236111111111112 | 0 |
| 0.9243055555555556 | 0 |
| 0.9249999999999999 | 0 |
| 0.9256944444444444 | 0 |
| 0.9263888888888889 | 0 |
| 0.9270833333333334 | 0 |
| 0.9277777777777777 | 0 |
| 0.9284722222222223 | 0 |
| 0.9291666666666667 | 0 |
| 0.9298611111111111 | 0 |
| 0.9305555555555555 | 0 |
| 0.93125 | 0 |
| 0.9319444444444445 | 0 |
| 0.9326388888888889 | 0 |
| 0.9333333333333332 | 0 |
| 0.9340277777777778 | 0 |
| 0.9347222222222222 | 0 |
| 0.9354166666666667 | 0 |
| 0.936111111111111 | 0 |
| 0.9368055555555556 | 0 |
| 0.9375 | 0 |
| 0.9381944444444444 | 0 |
| 0.938888888888889 | 0 |
| 0.9395833333333333 | 0 |
| 0.9402777777777778 | 0 |
| 0.9409722222222222 | 0 |
| 0.9416666666666668 | 0 |
| 0.9423611111111111 | 0 |
| 0.9430555555555555 | 0 |
| 0.94375 | 0 |
| 0.9444444444444445 | 0 |
| 0.9451388888888889 | 0 |
| 0.9458333333333333 | 0 |
| 0.9465277777777777 | 0 |
| 0.9472222222222223 | 0 |
| 0.9479166666666666 | 0 |
| 0.9486111111111111 | 0 |
| 0.9493055555555556 | 0 |
| 0.9500000000000001 | 0 |
| 0.9506944444444444 | 0 |
| 0.9513888888888888 | 0 |
| 0.9520833333333334 | 0 |
| 0.9527777777777778 | 0 |
| 0.9534722222222222 | 0 |
| 0.9541666666666666 | 0 |
| 0.9548611111111112 | 0 |
| 0.9555555555555556 | 0 |
| 0.9562499999999999 | 0 |
| 0.9569444444444444 | 0 |
| 0.9576388888888889 | 0 |
| 0.9583333333333334 | 0 |
| 0.9590277777777777 | 0 |
| 0.9597222222222223 | 0 |
| 0.9604166666666667 | 0 |
| 0.9611111111111111 | 0 |
| 0.9618055555555555 | 0 |
| 0.9625 | 0 |
| 0.9631944444444445 | 0 |
| 0.9638888888888889 | 0 |
| 0.9645833333333332 | 0 |
| 0.9652777777777778 | 0 |
| 0.9659722222222222 | 0 |
| 0.9666666666666667 | 0 |
| 0.967361111111111 | 0 |
| 0.9680555555555556 | 0 |
| 0.96875 | 0 |
| 0.9694444444444444 | 0 |
| 0.970138888888889 | 0 |
| 0.9708333333333333 | 0 |
| 0.9715277777777778 | 0 |
| 0.9722222222222222 | 0 |
| 0.9729166666666668 | 0 |
| 0.9736111111111111 | 0 |
| 0.9743055555555555 | 0 |
| 0.975 | 0 |
| 0.9756944444444445 | 0 |
| 0.9763888888888889 | 0 |
| 0.9770833333333333 | 0 |
| 0.9777777777777777 | 0 |
| 0.9784722222222223 | 0 |
| 0.9791666666666666 | 0 |
| 0.9798611111111111 | 0 |
| 0.9805555555555556 | 0 |
| 0.9812500000000001 | 0 |
| 0.9819444444444444 | 0 |
| 0.9826388888888888 | 0 |
| 0.9833333333333334 | 0 |
| 0.9840277777777778 | 0 |
| 0.9847222222222222 | 0 |
| 0.9854166666666666 | 0 |
| 0.9861111111111112 | 0 |
| 0.9868055555555556 | 0 |
| 0.9874999999999999 | 0 |
| 0.9881944444444444 | 0 |
| 0.9888888888888889 | 0 |
| 0.9895833333333334 | 0 |
| 0.9902777777777777 | 0 |
| 0.9909722222222223 | 0 |
| 0.9916666666666667 | 0 |
| 0.9923611111111111 | 0 |
| 0.9930555555555555 | 0 |
| 0.99375 | 0 |
| 0.9944444444444445 | 0 |
| 0.9951388888888889 | 0 |
| 0.9958333333333332 | 0 |
| 0.9965277777777778 | 0 |
| 0.9972222222222222 | 0 |
| 0.9979166666666667 | 0 |
| 0.998611111111111 | 0 |
| 0.9993055555555556 | 0 |